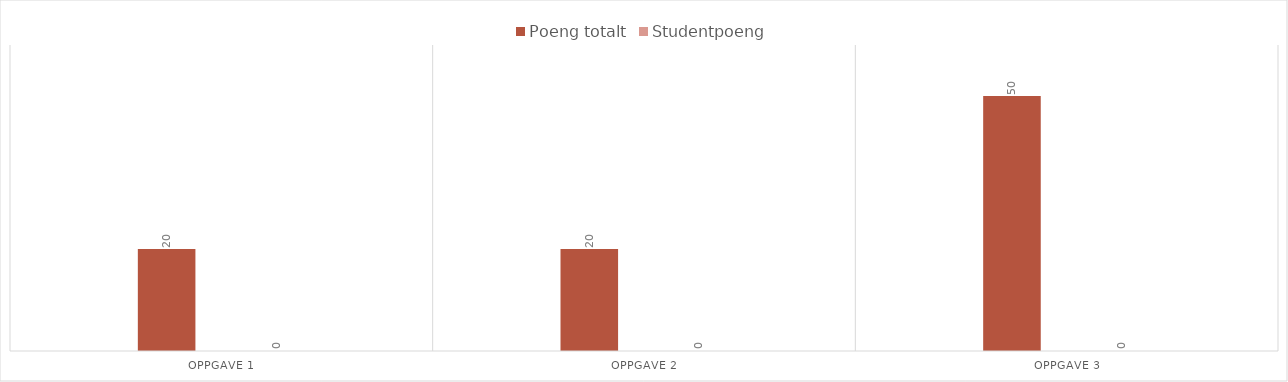
| Category | Poeng totalt | Studentpoeng |
|---|---|---|
| Oppgave 1 | 20 | 20 |
| Oppgave 2 | 20 | 20 |
| Oppgave 3 | 50 | 50 |